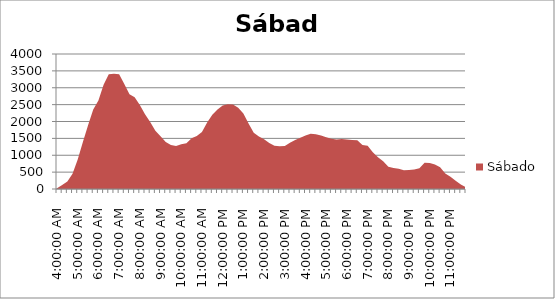
| Category | Sábado |
|---|---|
| 0.16666666666666663 | 19 |
| 0.1770833333333333 | 115 |
| 0.18749999999999994 | 219 |
| 0.1979166666666666 | 455 |
| 0.20833333333333326 | 874 |
| 0.21874999999999992 | 1394 |
| 0.22916666666666657 | 1892 |
| 0.23958333333333323 | 2357 |
| 0.2499999999999999 | 2623 |
| 0.2604166666666666 | 3087 |
| 0.27083333333333326 | 3401 |
| 0.28124999999999994 | 3418 |
| 0.29166666666666663 | 3401 |
| 0.3020833333333333 | 3108 |
| 0.3125 | 2807 |
| 0.3229166666666667 | 2721 |
| 0.33333333333333337 | 2486 |
| 0.34375000000000006 | 2216 |
| 0.35416666666666674 | 1983 |
| 0.3645833333333334 | 1727 |
| 0.3750000000000001 | 1563 |
| 0.3854166666666668 | 1389 |
| 0.3958333333333335 | 1301 |
| 0.40625000000000017 | 1274 |
| 0.41666666666666685 | 1326 |
| 0.42708333333333354 | 1357 |
| 0.4375000000000002 | 1503 |
| 0.4479166666666669 | 1570 |
| 0.4583333333333336 | 1689 |
| 0.4687500000000003 | 1970 |
| 0.47916666666666696 | 2198 |
| 0.48958333333333365 | 2353 |
| 0.5000000000000003 | 2474 |
| 0.510416666666667 | 2512 |
| 0.5208333333333336 | 2506 |
| 0.5312500000000002 | 2405 |
| 0.5416666666666669 | 2236 |
| 0.5520833333333335 | 1941 |
| 0.5625000000000001 | 1666 |
| 0.5729166666666667 | 1558 |
| 0.5833333333333334 | 1473 |
| 0.59375 | 1363 |
| 0.6041666666666666 | 1279 |
| 0.6145833333333333 | 1264 |
| 0.6249999999999999 | 1271 |
| 0.6354166666666665 | 1369 |
| 0.6458333333333331 | 1451 |
| 0.6562499999999998 | 1520 |
| 0.6666666666666664 | 1587 |
| 0.677083333333333 | 1637 |
| 0.6874999999999997 | 1625 |
| 0.6979166666666663 | 1587 |
| 0.7083333333333329 | 1531 |
| 0.7187499999999996 | 1486 |
| 0.7291666666666662 | 1465 |
| 0.7395833333333328 | 1482 |
| 0.7499999999999994 | 1468 |
| 0.7604166666666661 | 1454 |
| 0.7708333333333327 | 1441 |
| 0.7812499999999993 | 1303 |
| 0.791666666666666 | 1279 |
| 0.8020833333333326 | 1089 |
| 0.8124999999999992 | 938 |
| 0.8229166666666659 | 825 |
| 0.8333333333333325 | 662 |
| 0.8437499999999991 | 624 |
| 0.8541666666666657 | 599 |
| 0.8645833333333324 | 553 |
| 0.874999999999999 | 564 |
| 0.8854166666666656 | 577 |
| 0.8958333333333323 | 612 |
| 0.9062499999999989 | 777 |
| 0.9166666666666655 | 774 |
| 0.9270833333333321 | 727 |
| 0.9374999999999988 | 642 |
| 0.9479166666666654 | 459 |
| 0.958333333333332 | 362 |
| 0.9687499999999987 | 247 |
| 0.9791666666666653 | 134 |
| 0.9895833333333319 | 49 |